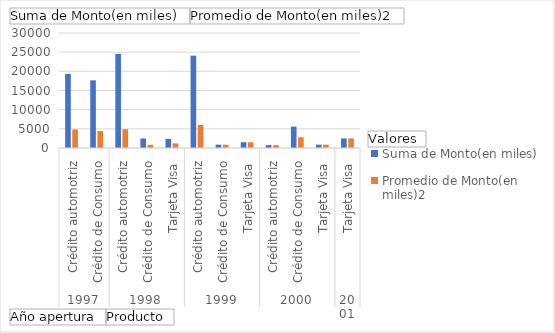
| Category | Suma de Monto(en miles) | Promedio de Monto(en miles)2 |
|---|---|---|
| 0 | 19347 | 4836.75 |
| 1 | 17654 | 4413.5 |
| 2 | 24520 | 4904 |
| 3 | 2485 | 828.333 |
| 4 | 2401 | 1200.5 |
| 5 | 24088 | 6022 |
| 6 | 865 | 865 |
| 7 | 1500 | 1500 |
| 8 | 750 | 750 |
| 9 | 5581 | 2790.5 |
| 10 | 866 | 866 |
| 11 | 2500 | 2500 |